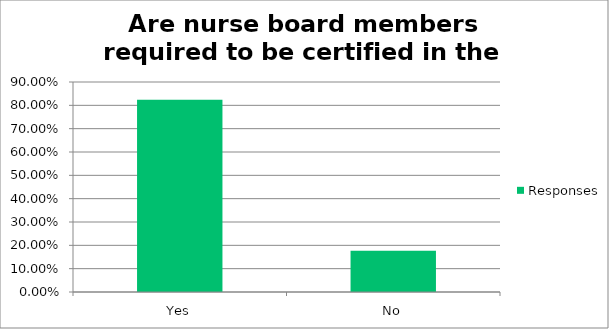
| Category | Responses |
|---|---|
| Yes | 0.823 |
| No | 0.176 |